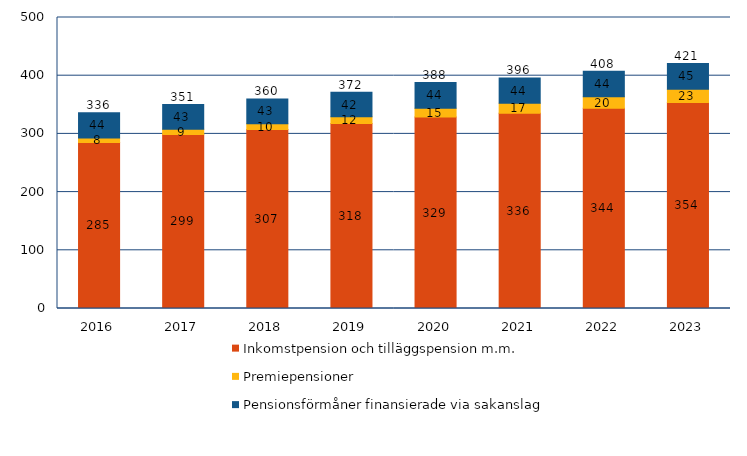
| Category | Inkomstpension och tilläggspension m.m. | Premiepensioner | Pensionsförmåner finansierade via sakanslag | Series 3 |
|---|---|---|---|---|
| 2016.0 | 285.357 | 7.598 | 43.541 | 336.496 |
| 2017.0 | 299.103 | 9.081 | 42.508 | 350.692 |
| 2018.0 | 307.355 | 10.141 | 42.538 | 360.034 |
| 2019.0 | 317.676 | 11.72 | 42.125 | 371.521 |
| 2020.0 | 329.161 | 14.825 | 44.24 | 388.226 |
| 2021.0 | 335.588 | 17.118 | 43.518 | 396.224 |
| 2022.0 | 344.077 | 19.724 | 43.764 | 407.565 |
| 2023.0 | 353.985 | 22.551 | 44.541 | 421.077 |